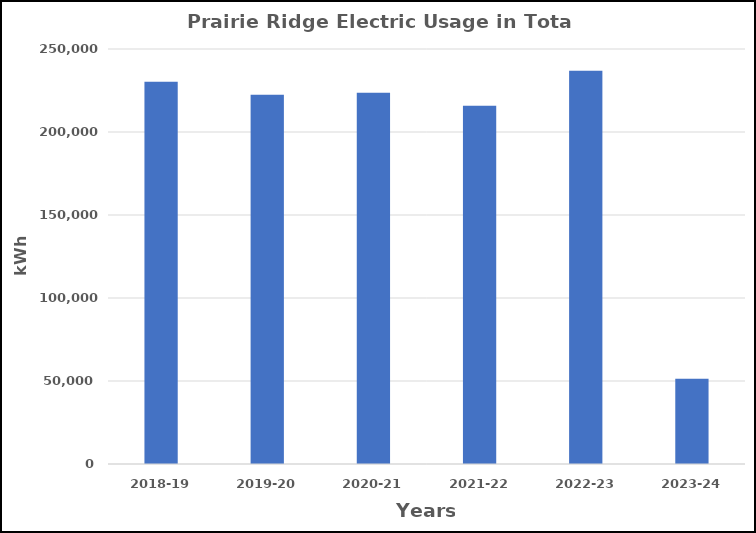
| Category | Series 0 |
|---|---|
| 2018-19 | 230203 |
| 2019-20 | 222368 |
| 2020-21 | 223661 |
| 2021-22 | 215748 |
| 2022-23 | 236847 |
| 2023-24 | 51414 |